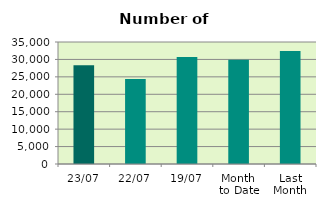
| Category | Series 0 |
|---|---|
| 23/07 | 28304 |
| 22/07 | 24362 |
| 19/07 | 30668 |
| Month 
to Date | 29938.235 |
| Last
Month | 32421.5 |